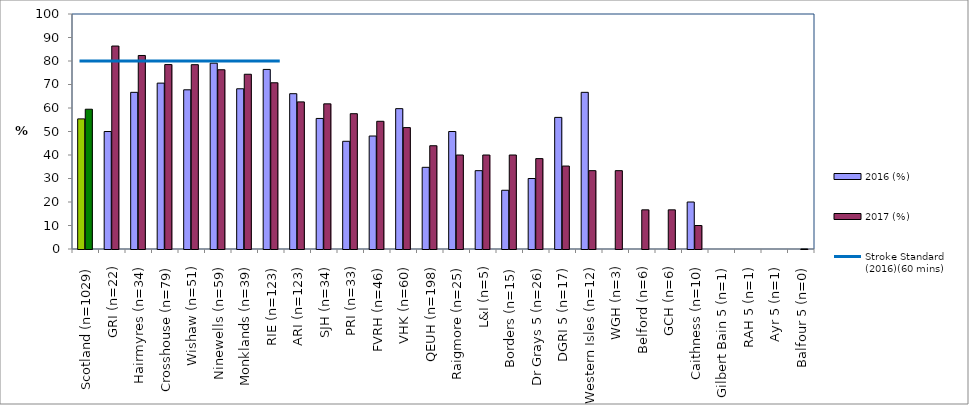
| Category | 2016 (%) | 2017 (%) |
|---|---|---|
| Scotland (n=1029) | 55.369 | 59.475 |
| GRI (n=22) | 50 | 86.364 |
| Hairmyres (n=34) | 66.667 | 82.353 |
| Crosshouse (n=79) | 70.588 | 78.481 |
| Wishaw (n=51) | 67.742 | 78.431 |
| Ninewells (n=59) | 79.07 | 76.271 |
| Monklands (n=39) | 68.182 | 74.359 |
| RIE (n=123) | 76.415 | 70.732 |
| ARI (n=123) | 66.087 | 62.602 |
| SJH (n=34) | 55.556 | 61.765 |
| PRI (n=33) | 45.833 | 57.576 |
| FVRH (n=46) | 48.077 | 54.348 |
| VHK (n=60) | 59.722 | 51.667 |
| QEUH (n=198) | 34.759 | 43.939 |
| Raigmore (n=25) | 50 | 40 |
| L&I (n=5) | 33.333 | 40 |
| Borders (n=15) | 25 | 40 |
| Dr Grays 5 (n=26) | 30 | 38.462 |
| DGRI 5 (n=17) | 56 | 35.294 |
| Western Isles (n=12) | 66.667 | 33.333 |
| WGH (n=3) | 0 | 33.333 |
| Belford (n=6) | 0 | 16.667 |
| GCH (n=6) | 0 | 16.667 |
| Caithness (n=10) | 20 | 10 |
| Gilbert Bain 5 (n=1) | 0 | 0 |
| RAH 5 (n=1) | 0 | 0 |
| Ayr 5 (n=1) | 0 | 0 |
| Balfour 5 (n=0) | 0 | 0 |